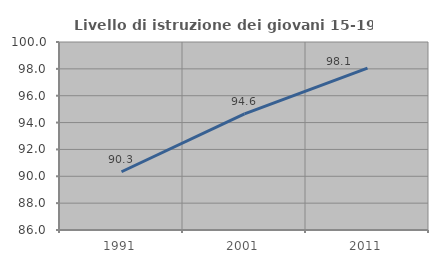
| Category | Livello di istruzione dei giovani 15-19 anni |
|---|---|
| 1991.0 | 90.338 |
| 2001.0 | 94.644 |
| 2011.0 | 98.059 |